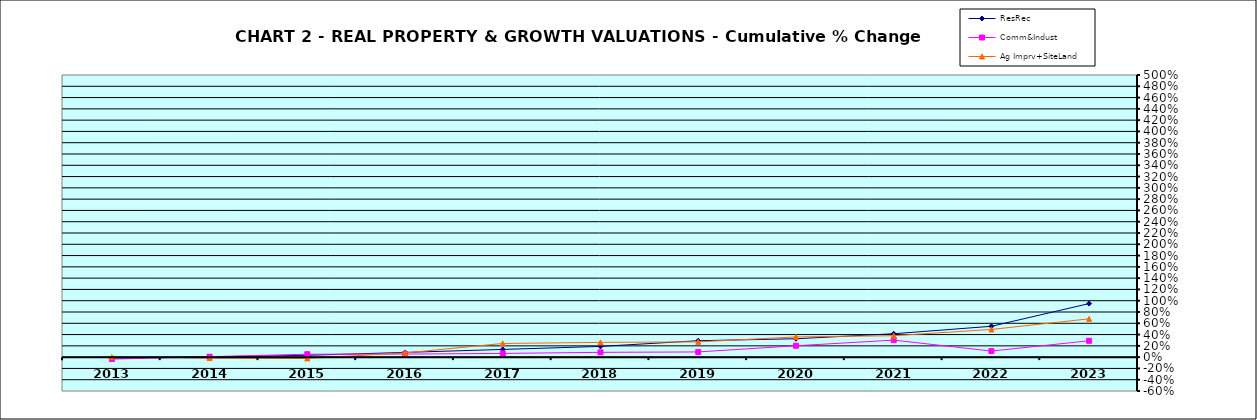
| Category | ResRec | Comm&Indust | Ag Imprv+SiteLand |
|---|---|---|---|
| 2013.0 | -0.018 | -0.034 | 0 |
| 2014.0 | 0.005 | 0.008 | -0.016 |
| 2015.0 | 0.032 | 0.052 | -0.023 |
| 2016.0 | 0.084 | 0.054 | 0.075 |
| 2017.0 | 0.137 | 0.066 | 0.242 |
| 2018.0 | 0.19 | 0.085 | 0.262 |
| 2019.0 | 0.291 | 0.092 | 0.271 |
| 2020.0 | 0.326 | 0.202 | 0.358 |
| 2021.0 | 0.415 | 0.301 | 0.38 |
| 2022.0 | 0.547 | 0.108 | 0.491 |
| 2023.0 | 0.949 | 0.29 | 0.679 |